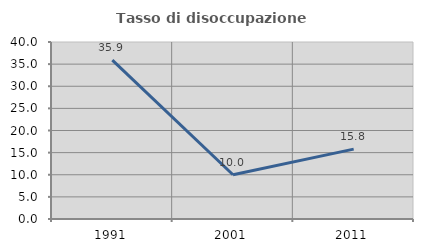
| Category | Tasso di disoccupazione giovanile  |
|---|---|
| 1991.0 | 35.897 |
| 2001.0 | 10 |
| 2011.0 | 15.789 |